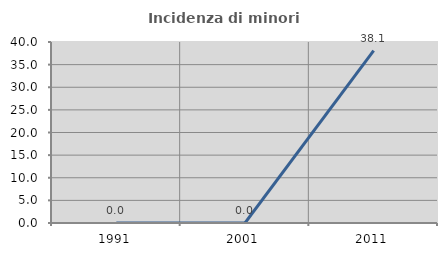
| Category | Incidenza di minori stranieri |
|---|---|
| 1991.0 | 0 |
| 2001.0 | 0 |
| 2011.0 | 38.095 |